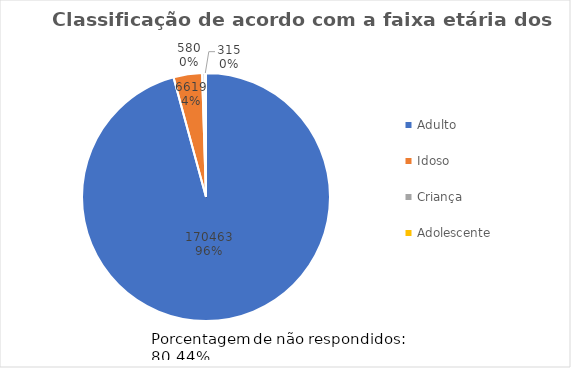
| Category | Series 0 |
|---|---|
| Adulto | 170463 |
| Idoso | 6619 |
| Criança | 580 |
| Adolescente | 315 |